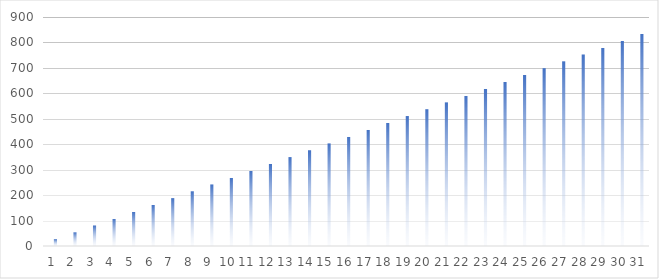
| Category | Monat | Ziel |
|---|---|---|
| 0 | 0 | 26.882 |
| 1 | 0 | 53.763 |
| 2 | 0 | 80.645 |
| 3 | 0 | 107.527 |
| 4 | 0 | 134.409 |
| 5 | 0 | 161.29 |
| 6 | 0 | 188.172 |
| 7 | 0 | 215.054 |
| 8 | 0 | 241.935 |
| 9 | 0 | 268.817 |
| 10 | 0 | 295.699 |
| 11 | 0 | 322.581 |
| 12 | 0 | 349.462 |
| 13 | 0 | 376.344 |
| 14 | 0 | 403.226 |
| 15 | 0 | 430.108 |
| 16 | 0 | 456.989 |
| 17 | 0 | 483.871 |
| 18 | 0 | 510.753 |
| 19 | 0 | 537.634 |
| 20 | 0 | 564.516 |
| 21 | 0 | 591.398 |
| 22 | 0 | 618.28 |
| 23 | 0 | 645.161 |
| 24 | 0 | 672.043 |
| 25 | 0 | 698.925 |
| 26 | 0 | 725.806 |
| 27 | 0 | 752.688 |
| 28 | 0 | 779.57 |
| 29 | 0 | 806.452 |
| 30 | 0 | 833.333 |